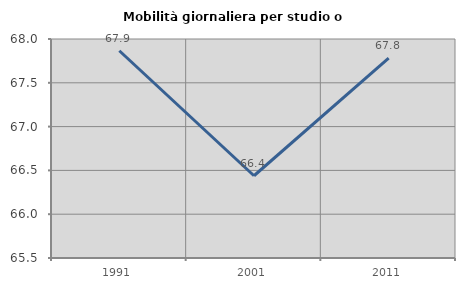
| Category | Mobilità giornaliera per studio o lavoro |
|---|---|
| 1991.0 | 67.866 |
| 2001.0 | 66.439 |
| 2011.0 | 67.78 |